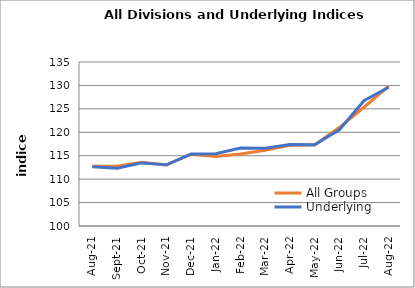
| Category | All Groups | Underlying |
|---|---|---|
| 2021-08-01 | 112.735 | 112.633 |
| 2021-09-01 | 112.778 | 112.306 |
| 2021-10-01 | 113.609 | 113.469 |
| 2021-11-01 | 113.04 | 113.069 |
| 2021-12-01 | 115.331 | 115.373 |
| 2022-01-01 | 114.841 | 115.444 |
| 2022-02-01 | 115.348 | 116.622 |
| 2022-03-01 | 116.161 | 116.584 |
| 2022-04-01 | 117.224 | 117.408 |
| 2022-05-01 | 117.307 | 117.326 |
| 2022-06-01 | 121.013 | 120.516 |
| 2022-07-01 | 125.348 | 126.726 |
| 2022-08-01 | 129.854 | 129.6 |